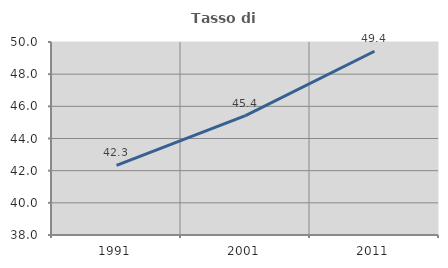
| Category | Tasso di occupazione   |
|---|---|
| 1991.0 | 42.324 |
| 2001.0 | 45.42 |
| 2011.0 | 49.425 |